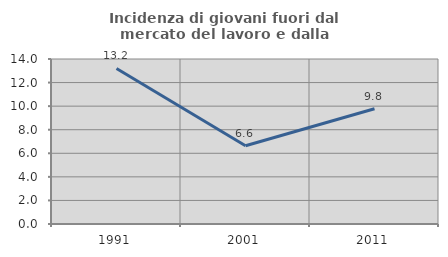
| Category | Incidenza di giovani fuori dal mercato del lavoro e dalla formazione  |
|---|---|
| 1991.0 | 13.198 |
| 2001.0 | 6.635 |
| 2011.0 | 9.783 |